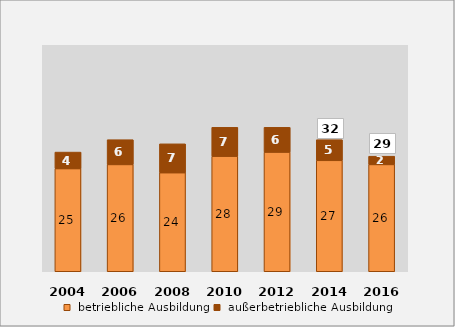
| Category |  betriebliche Ausbildung |  außerbetriebliche Ausbildung |
|---|---|---|
| 2004.0 | 25 | 4 |
| 2006.0 | 26 | 6 |
| 2008.0 | 24 | 7 |
| 2010.0 | 28 | 7 |
| 2012.0 | 29 | 6 |
| 2014.0 | 27 | 5 |
| 2016.0 | 26 | 2 |